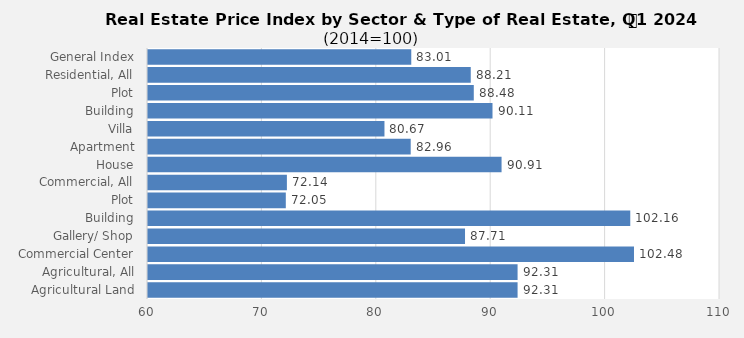
| Category | 2024 |
|---|---|
| General Index | 83.013 |
| Residential, All | 88.213 |
| Plot | 88.478 |
| Building | 90.114 |
| Villa | 80.67 |
| Apartment | 82.964 |
| House | 90.906 |
| Commercial, All | 72.141 |
| Plot | 72.046 |
| Building | 102.156 |
| Gallery/ Shop | 87.711 |
| Commercial Center | 102.482 |
| Agricultural, All | 92.306 |
| Agricultural Land | 92.306 |